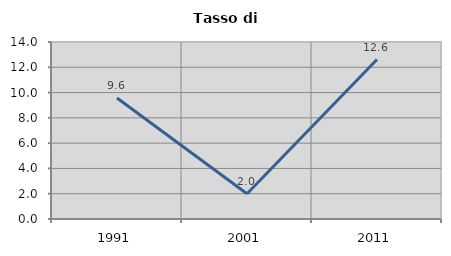
| Category | Tasso di disoccupazione   |
|---|---|
| 1991.0 | 9.574 |
| 2001.0 | 2 |
| 2011.0 | 12.613 |